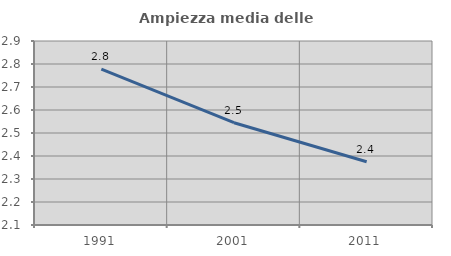
| Category | Ampiezza media delle famiglie |
|---|---|
| 1991.0 | 2.778 |
| 2001.0 | 2.545 |
| 2011.0 | 2.375 |